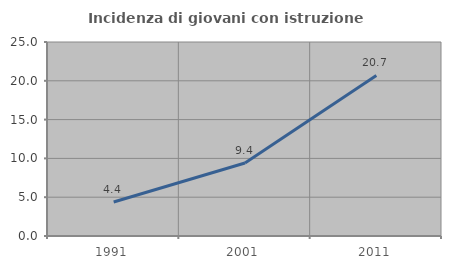
| Category | Incidenza di giovani con istruzione universitaria |
|---|---|
| 1991.0 | 4.386 |
| 2001.0 | 9.412 |
| 2011.0 | 20.69 |